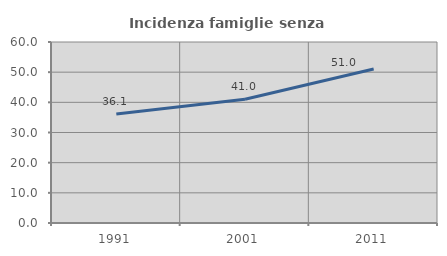
| Category | Incidenza famiglie senza nuclei |
|---|---|
| 1991.0 | 36.123 |
| 2001.0 | 41 |
| 2011.0 | 51.042 |